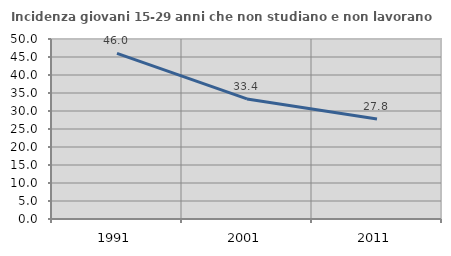
| Category | Incidenza giovani 15-29 anni che non studiano e non lavorano  |
|---|---|
| 1991.0 | 46.015 |
| 2001.0 | 33.356 |
| 2011.0 | 27.759 |